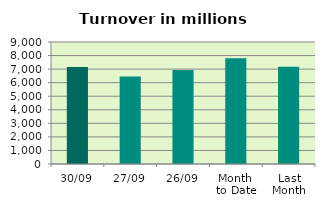
| Category | Series 0 |
|---|---|
| 30/09 | 7151.94 |
| 27/09 | 6461.134 |
| 26/09 | 6940.175 |
| Month 
to Date | 7802.515 |
| Last
Month | 7181.07 |